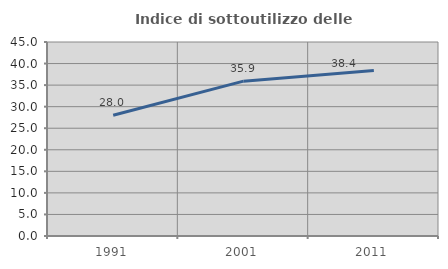
| Category | Indice di sottoutilizzo delle abitazioni  |
|---|---|
| 1991.0 | 27.995 |
| 2001.0 | 35.916 |
| 2011.0 | 38.372 |